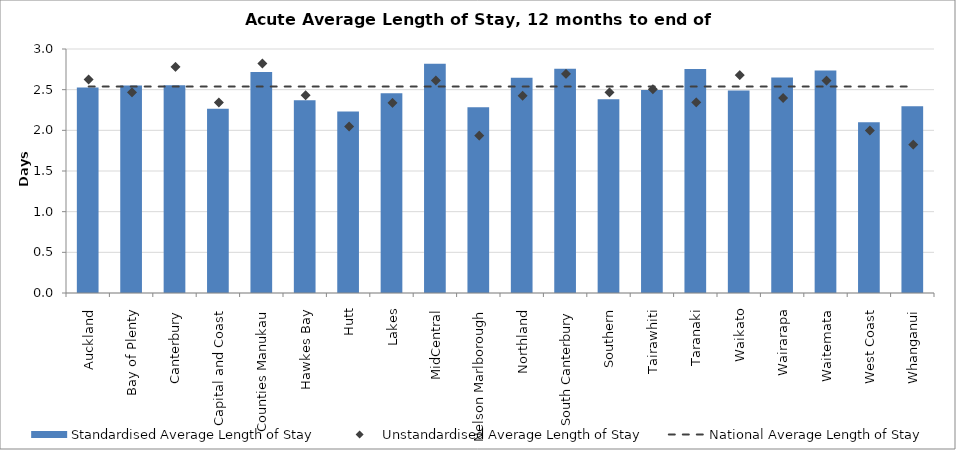
| Category | Standardised Average Length of Stay |
|---|---|
| Auckland | 2.528 |
| Bay of Plenty | 2.55 |
| Canterbury | 2.555 |
| Capital and Coast | 2.265 |
| Counties Manukau | 2.718 |
| Hawkes Bay | 2.371 |
| Hutt | 2.232 |
| Lakes | 2.455 |
| MidCentral | 2.818 |
| Nelson Marlborough | 2.282 |
| Northland | 2.645 |
| South Canterbury | 2.756 |
| Southern | 2.381 |
| Tairawhiti | 2.496 |
| Taranaki | 2.756 |
| Waikato | 2.49 |
| Wairarapa | 2.651 |
| Waitemata | 2.735 |
| West Coast | 2.101 |
| Whanganui | 2.296 |